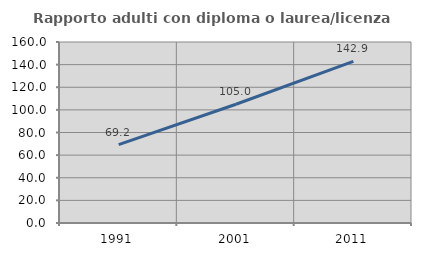
| Category | Rapporto adulti con diploma o laurea/licenza media  |
|---|---|
| 1991.0 | 69.231 |
| 2001.0 | 105 |
| 2011.0 | 142.857 |